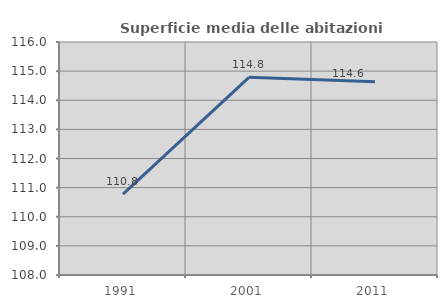
| Category | Superficie media delle abitazioni occupate |
|---|---|
| 1991.0 | 110.778 |
| 2001.0 | 114.785 |
| 2011.0 | 114.635 |